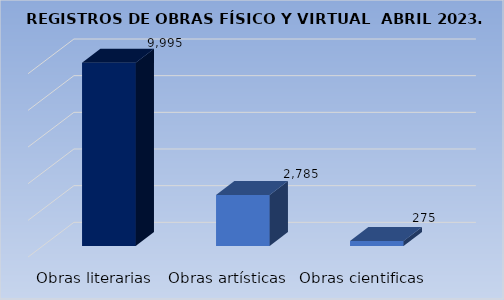
| Category | Cantidad |
|---|---|
| Obras literarias | 9995 |
| Obras artísticas | 2785 |
| Obras cientificas | 275 |